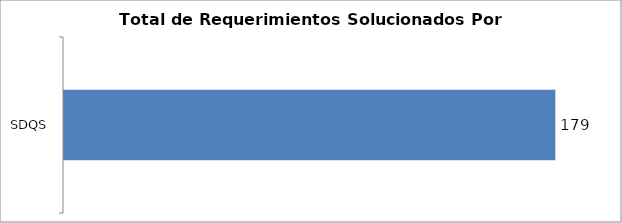
| Category | Total |
|---|---|
| SDQS | 179 |